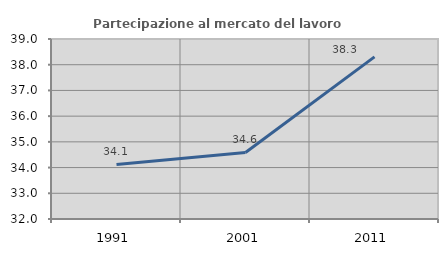
| Category | Partecipazione al mercato del lavoro  femminile |
|---|---|
| 1991.0 | 34.122 |
| 2001.0 | 34.589 |
| 2011.0 | 38.305 |